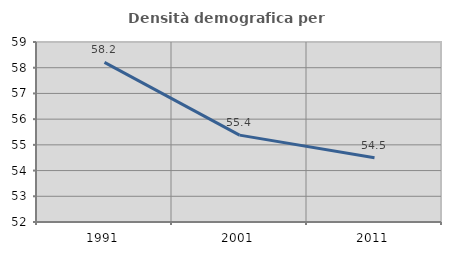
| Category | Densità demografica |
|---|---|
| 1991.0 | 58.207 |
| 2001.0 | 55.379 |
| 2011.0 | 54.498 |